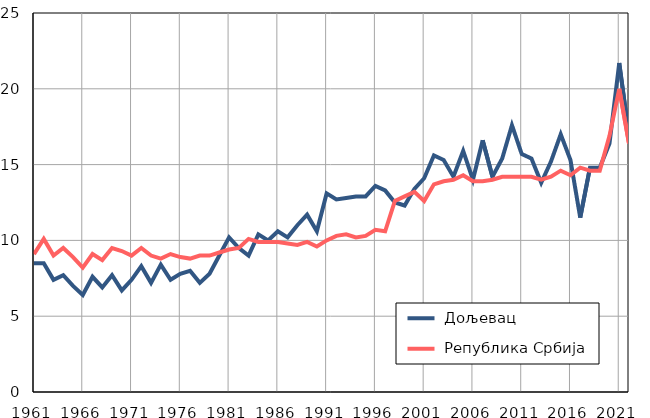
| Category |  Дољевац |  Република Србија |
|---|---|---|
| 1961.0 | 8.5 | 9.1 |
| 1962.0 | 8.5 | 10.1 |
| 1963.0 | 7.4 | 9 |
| 1964.0 | 7.7 | 9.5 |
| 1965.0 | 7 | 8.9 |
| 1966.0 | 6.4 | 8.2 |
| 1967.0 | 7.6 | 9.1 |
| 1968.0 | 6.9 | 8.7 |
| 1969.0 | 7.7 | 9.5 |
| 1970.0 | 6.7 | 9.3 |
| 1971.0 | 7.4 | 9 |
| 1972.0 | 8.3 | 9.5 |
| 1973.0 | 7.2 | 9 |
| 1974.0 | 8.4 | 8.8 |
| 1975.0 | 7.4 | 9.1 |
| 1976.0 | 7.8 | 8.9 |
| 1977.0 | 8 | 8.8 |
| 1978.0 | 7.2 | 9 |
| 1979.0 | 7.8 | 9 |
| 1980.0 | 9 | 9.2 |
| 1981.0 | 10.2 | 9.4 |
| 1982.0 | 9.5 | 9.5 |
| 1983.0 | 9 | 10.1 |
| 1984.0 | 10.4 | 9.9 |
| 1985.0 | 10 | 9.9 |
| 1986.0 | 10.6 | 9.9 |
| 1987.0 | 10.2 | 9.8 |
| 1988.0 | 11 | 9.7 |
| 1989.0 | 11.7 | 9.9 |
| 1990.0 | 10.6 | 9.6 |
| 1991.0 | 13.1 | 10 |
| 1992.0 | 12.7 | 10.3 |
| 1993.0 | 12.8 | 10.4 |
| 1994.0 | 12.9 | 10.2 |
| 1995.0 | 12.9 | 10.3 |
| 1996.0 | 13.6 | 10.7 |
| 1997.0 | 13.3 | 10.6 |
| 1998.0 | 12.5 | 12.6 |
| 1999.0 | 12.3 | 12.9 |
| 2000.0 | 13.4 | 13.2 |
| 2001.0 | 14.1 | 12.6 |
| 2002.0 | 15.6 | 13.7 |
| 2003.0 | 15.3 | 13.9 |
| 2004.0 | 14.2 | 14 |
| 2005.0 | 15.9 | 14.3 |
| 2006.0 | 14 | 13.9 |
| 2007.0 | 16.6 | 13.9 |
| 2008.0 | 14.2 | 14 |
| 2009.0 | 15.4 | 14.2 |
| 2010.0 | 17.6 | 14.2 |
| 2011.0 | 15.7 | 14.2 |
| 2012.0 | 15.4 | 14.2 |
| 2013.0 | 13.8 | 14 |
| 2014.0 | 15.2 | 14.2 |
| 2015.0 | 17 | 14.6 |
| 2016.0 | 15.3 | 14.3 |
| 2017.0 | 11.5 | 14.8 |
| 2018.0 | 14.8 | 14.6 |
| 2019.0 | 14.8 | 14.6 |
| 2020.0 | 16.4 | 16.9 |
| 2021.0 | 21.7 | 20 |
| 2022.0 | 16.9 | 16.4 |